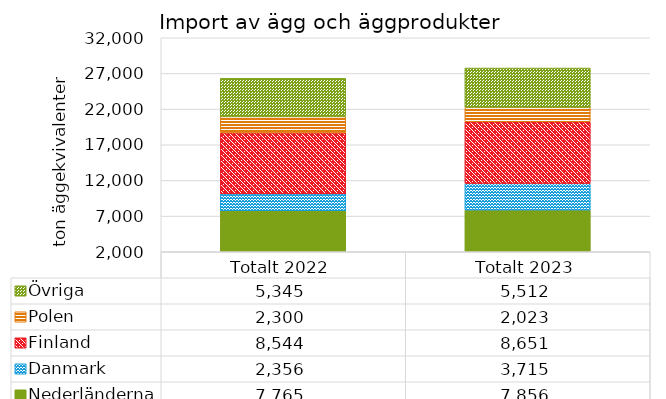
| Category | Nederländerna | Danmark | Finland | Polen | Övriga |
|---|---|---|---|---|---|
| Totalt 2022 | 7765.06 | 2356.08 | 8544 | 2300.28 | 5344.56 |
| Totalt 2023 | 7856.3 | 3714.56 | 8650.72 | 2023 | 5512.44 |